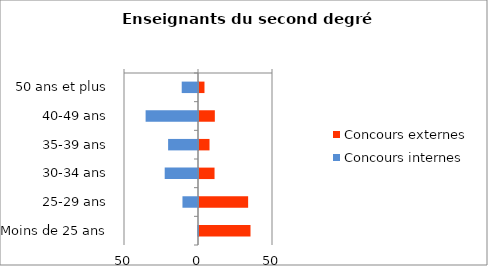
| Category | Concours externes | Concours internes |
|---|---|---|
| 50 ans et plus | 3.7 | -11 |
| 40-49 ans | 10.7 | -35.4 |
| 35-39 ans | 7.1 | -20.2 |
| 30-34 ans | 10.5 | -22.5 |
| 25-29 ans | 33.2 | -10.5 |
| Moins de 25 ans | 34.8 | -0.4 |